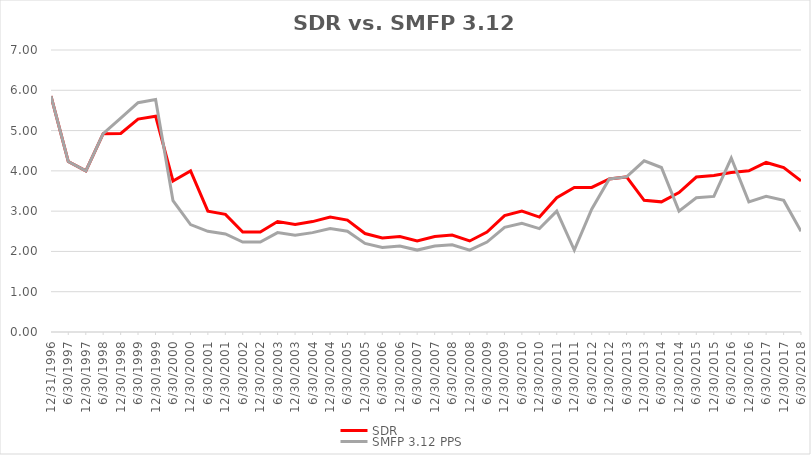
| Category | SDR | SMFP 3.12 PPS |
|---|---|---|
| 12/31/96 | 5.857 | 5.857 |
| 6/30/97 | 4.231 | 4.231 |
| 12/31/97 | 4 | 4 |
| 6/30/98 | 4.923 | 4.923 |
| 12/31/98 | 4.929 | 5.308 |
| 6/30/99 | 5.286 | 5.692 |
| 12/31/99 | 5.357 | 5.769 |
| 6/30/00 | 3.75 | 3.261 |
| 12/31/00 | 4 | 2.667 |
| 6/30/01 | 3 | 2.5 |
| 12/31/01 | 2.92 | 2.433 |
| 6/30/02 | 2.481 | 2.233 |
| 12/31/02 | 2.481 | 2.233 |
| 6/30/03 | 2.741 | 2.467 |
| 12/31/03 | 2.667 | 2.4 |
| 6/30/04 | 2.741 | 2.467 |
| 12/31/04 | 2.852 | 2.567 |
| 6/30/05 | 2.778 | 2.5 |
| 12/31/05 | 2.444 | 2.2 |
| 6/30/06 | 2.333 | 2.1 |
| 12/31/06 | 2.37 | 2.133 |
| 6/30/07 | 2.259 | 2.033 |
| 12/31/07 | 2.37 | 2.133 |
| 6/30/08 | 2.407 | 2.167 |
| 12/31/08 | 2.259 | 2.033 |
| 6/30/09 | 2.481 | 2.233 |
| 12/31/09 | 2.889 | 2.6 |
| 6/30/10 | 3 | 2.7 |
| 12/31/10 | 2.852 | 2.567 |
| 6/30/11 | 3.333 | 3 |
| 12/31/11 | 3.588 | 2.033 |
| 6/30/12 | 3.588 | 3.05 |
| 12/31/12 | 3.8 | 3.8 |
| 6/30/13 | 3.85 | 3.85 |
| 12/31/13 | 3.269 | 4.25 |
| 6/30/14 | 3.231 | 4.084 |
| 12/31/14 | 3.462 | 3 |
| 6/30/15 | 3.846 | 3.333 |
| 12/31/15 | 3.885 | 3.367 |
| 6/30/16 | 3.958 | 4.318 |
| 12/31/16 | 4 | 3.232 |
| 6/30/17 | 4.208 | 3.367 |
| 12/31/17 | 4.083 | 3.267 |
| 6/30/18 | 3.75 | 2.5 |